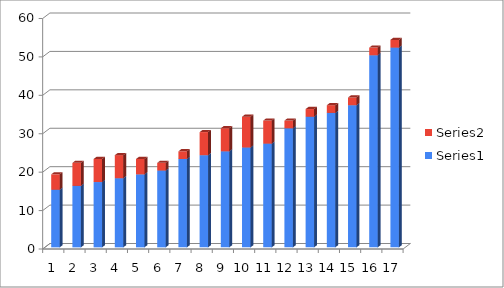
| Category | Series 0 | Series 1 |
|---|---|---|
| 0 | 15 | 4 |
| 1 | 16 | 6 |
| 2 | 17 | 6 |
| 3 | 18 | 6 |
| 4 | 19 | 4 |
| 5 | 20 | 2 |
| 6 | 23 | 2 |
| 7 | 24 | 6 |
| 8 | 25 | 6 |
| 9 | 26 | 8 |
| 10 | 27 | 6 |
| 11 | 31 | 2 |
| 12 | 34 | 2 |
| 13 | 35 | 2 |
| 14 | 37 | 2 |
| 15 | 50 | 2 |
| 16 | 52 | 2 |